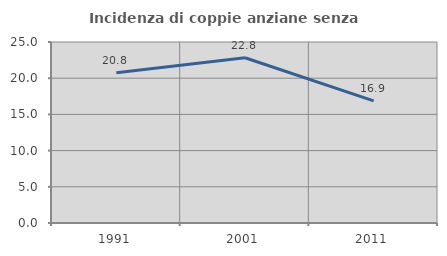
| Category | Incidenza di coppie anziane senza figli  |
|---|---|
| 1991.0 | 20.767 |
| 2001.0 | 22.826 |
| 2011.0 | 16.878 |